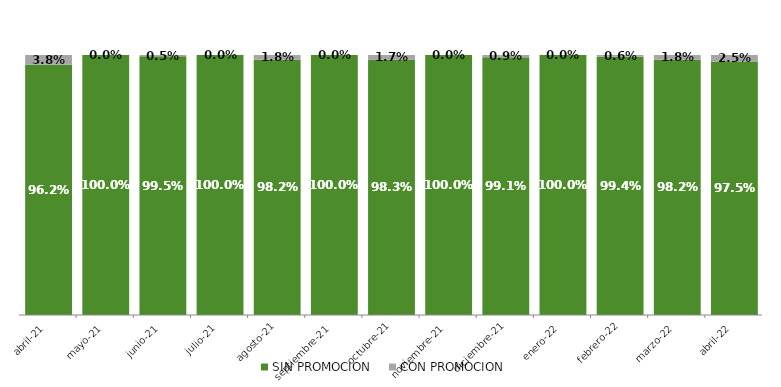
| Category | SIN PROMOCION   | CON PROMOCION   |
|---|---|---|
| 2021-04-01 | 0.962 | 0.038 |
| 2021-05-01 | 1 | 0 |
| 2021-06-01 | 0.995 | 0.005 |
| 2021-07-01 | 1 | 0 |
| 2021-08-01 | 0.982 | 0.018 |
| 2021-09-01 | 1 | 0 |
| 2021-10-01 | 0.983 | 0.017 |
| 2021-11-01 | 1 | 0 |
| 2021-12-01 | 0.991 | 0.009 |
| 2022-01-01 | 1 | 0 |
| 2022-02-01 | 0.994 | 0.006 |
| 2022-03-01 | 0.982 | 0.018 |
| 2022-04-01 | 0.975 | 0.025 |